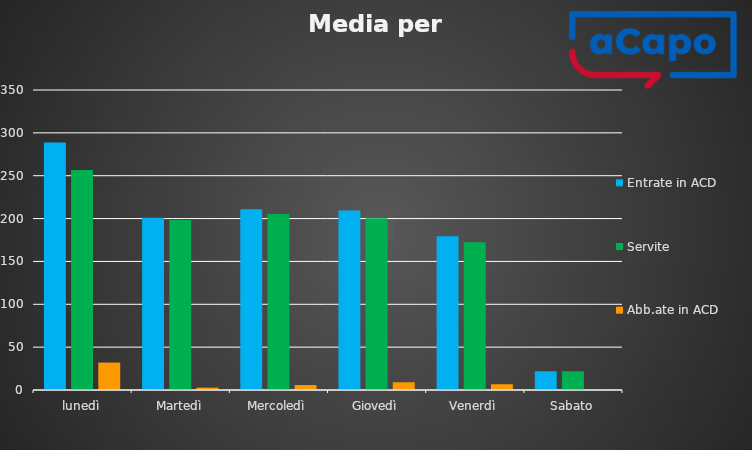
| Category | Entrate in ACD | Servite | Abb.ate in ACD |
|---|---|---|---|
| lunedì | 288.8 | 256.8 | 32 |
| Martedì | 201 | 198.25 | 2.75 |
| Mercoledì | 211 | 205.25 | 5.75 |
| Giovedì | 209.5 | 200.5 | 9 |
| Venerdì | 179.25 | 172.5 | 6.75 |
| Sabato | 21.8 | 21.8 | 0 |